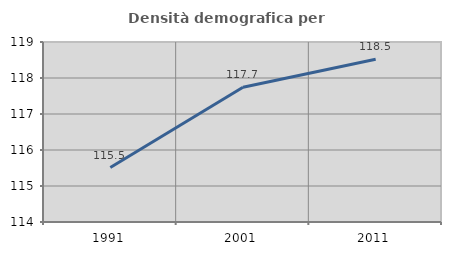
| Category | Densità demografica |
|---|---|
| 1991.0 | 115.513 |
| 2001.0 | 117.745 |
| 2011.0 | 118.522 |